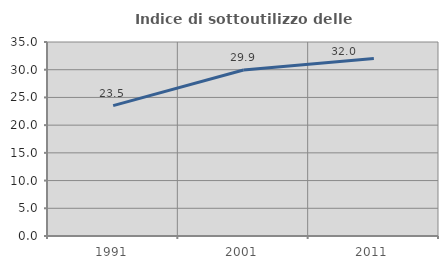
| Category | Indice di sottoutilizzo delle abitazioni  |
|---|---|
| 1991.0 | 23.514 |
| 2001.0 | 29.947 |
| 2011.0 | 32.024 |